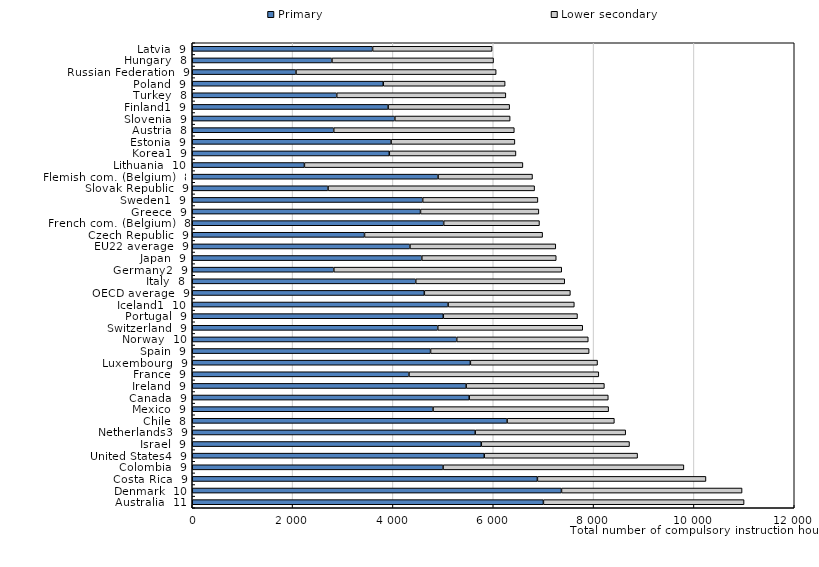
| Category | Primary | Lower secondary |
|---|---|---|
| Australia  11 | 7000 | 4000 |
| Denmark  10 | 7360 | 3600 |
| Costa Rica  9 | 6880 | 3360 |
| Colombia  9 | 5000 | 4800 |
| United States4  9 | 5820 | 3057 |
| Israel  9 | 5761.544 | 2954.5 |
| Netherlands3  9 | 5640 | 3000 |
| Chile  8 | 6276 | 2138.25 |
| Mexico  9 | 4800 | 3500 |
| Canada  9 | 5520.756 | 2772.405 |
| Ireland  9 | 5460 | 2755.2 |
| France  9 | 4320 | 3784 |
| Luxembourg  9 | 5544 | 2535 |
| Spain  9 | 4750.337 | 3160.994 |
| Norway  10 | 5272 | 2622 |
| Switzerland  9 | 4894 | 2890 |
| Portugal  9 | 5004 | 2675.25 |
| Iceland1  10 | 5100 | 2516 |
| OECD average  9 | 4626.268 | 2911.337 |
| Italy  8 | 4455 | 2970 |
| Germany2  9 | 2821.922 | 4543.556 |
| Japan  9 | 4575.947 | 2679.685 |
| EU22 average  9 | 4339.313 | 2907.276 |
| Czech Republic  9 | 3433.8 | 3550.2 |
| French com. (Belgium)  8 | 5012 | 1909.333 |
| Greece  9 | 4549.65 | 2359.632 |
| Sweden1  9 | 4593.333 | 2296.667 |
| Slovak Republic  9 | 2707.2 | 4117.2 |
| Flemish com. (Belgium)  8 | 4900 | 1882.667 |
| Lithuania  10 | 2235.936 | 4355 |
| Korea1  9 | 3928 | 2524.5 |
| Estonia  9 | 3963.75 | 2467.5 |
| Austria  8 | 2820 | 3600 |
| Slovenia  9 | 4038.75 | 2297.645 |
| Finland1  9 | 3904.5 | 2422.5 |
| Turkey  8 | 2880 | 3371.04 |
| Poland  9 | 3807 | 2430 |
| Russian Federation  9 | 2068 | 3990 |
| Hungary  8 | 2784.6 | 3221.4 |
| Latvia  9 | 3595.036 | 2381.333 |